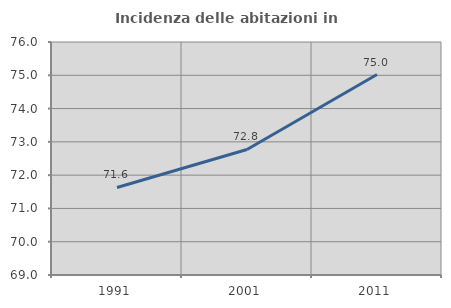
| Category | Incidenza delle abitazioni in proprietà  |
|---|---|
| 1991.0 | 71.63 |
| 2001.0 | 72.771 |
| 2011.0 | 75.022 |